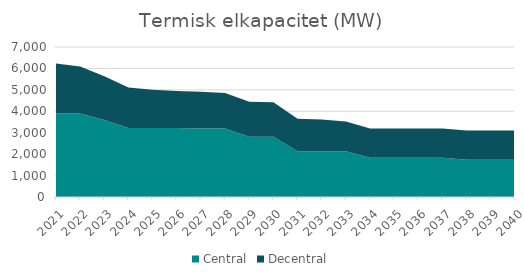
| Category | Central | Decentral |
|---|---|---|
| 2021.0 | 3894.5 | 2335.534 |
| 2022.0 | 3894.5 | 2194.803 |
| 2023.0 | 3594.5 | 2039.659 |
| 2024.0 | 3221.2 | 1894.447 |
| 2025.0 | 3221.2 | 1786.095 |
| 2026.0 | 3221.2 | 1727.977 |
| 2027.0 | 3198 | 1709.39 |
| 2028.0 | 3198 | 1653.018 |
| 2029.0 | 2813 | 1626.516 |
| 2030.0 | 2813 | 1613.204 |
| 2031.0 | 2140 | 1515.507 |
| 2032.0 | 2140 | 1479.312 |
| 2033.0 | 2140 | 1386.845 |
| 2034.0 | 1826 | 1375.302 |
| 2035.0 | 1826 | 1369.228 |
| 2036.0 | 1826 | 1367.777 |
| 2037.0 | 1826 | 1366.867 |
| 2038.0 | 1736 | 1362.92 |
| 2039.0 | 1736 | 1362.92 |
| 2040.0 | 1736 | 1362.92 |